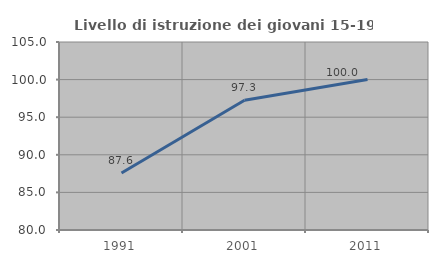
| Category | Livello di istruzione dei giovani 15-19 anni |
|---|---|
| 1991.0 | 87.584 |
| 2001.0 | 97.26 |
| 2011.0 | 100 |